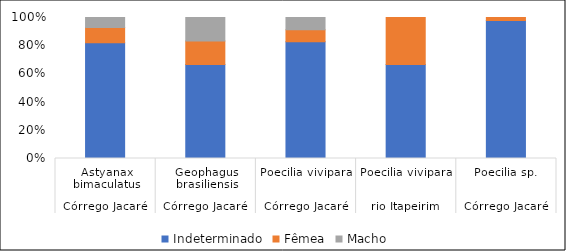
| Category | Indeterminado | Fêmea | Macho |
|---|---|---|---|
| 0 | 82.143 | 10.714 | 7.143 |
| 1 | 66.667 | 16.667 | 16.667 |
| 2 | 82.759 | 8.621 | 8.621 |
| 3 | 66.667 | 33.333 | 0 |
| 4 | 97.917 | 2.083 | 0 |